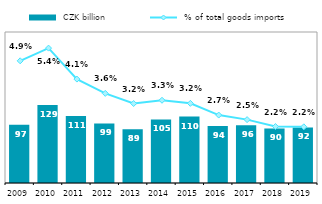
| Category |  CZK billion |
|---|---|
| 2009.0 | 96.558 |
| 2010.0 | 129.258 |
| 2011.0 | 110.978 |
| 2012.0 | 98.539 |
| 2013.0 | 89.173 |
| 2014.0 | 105.192 |
| 2015.0 | 110.049 |
| 2016.0 | 94.346 |
| 2017.0 | 95.711 |
| 2018.0 | 90.251 |
| 2019.0 | 91.931 |